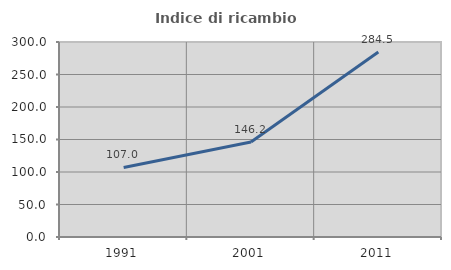
| Category | Indice di ricambio occupazionale  |
|---|---|
| 1991.0 | 106.957 |
| 2001.0 | 146.216 |
| 2011.0 | 284.491 |